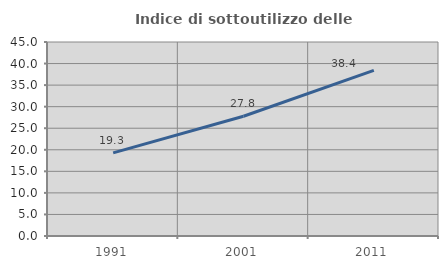
| Category | Indice di sottoutilizzo delle abitazioni  |
|---|---|
| 1991.0 | 19.281 |
| 2001.0 | 27.77 |
| 2011.0 | 38.399 |